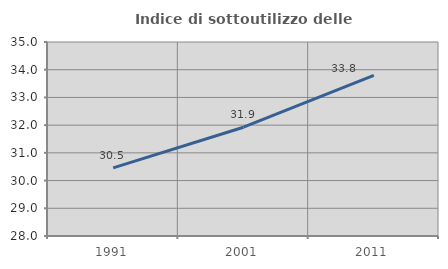
| Category | Indice di sottoutilizzo delle abitazioni  |
|---|---|
| 1991.0 | 30.458 |
| 2001.0 | 31.925 |
| 2011.0 | 33.794 |